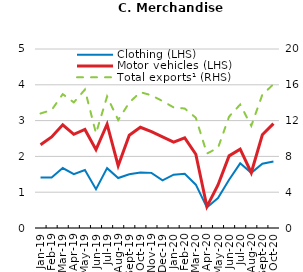
| Category | Clothing (LHS) | Motor vehicles (LHS) |
|---|---|---|
| 2019-01-01 | 1.414 | 2.328 |
| 2019-02-01 | 1.414 | 2.545 |
| 2019-03-01 | 1.674 | 2.883 |
| 2019-04-01 | 1.502 | 2.616 |
| 2019-05-01 | 1.621 | 2.753 |
| 2019-06-01 | 1.086 | 2.19 |
| 2019-07-01 | 1.672 | 2.9 |
| 2019-08-01 | 1.395 | 1.741 |
| 2019-09-01 | 1.5 | 2.592 |
| 2019-10-01 | 1.551 | 2.813 |
| 2019-11-01 | 1.54 | 2.69 |
| 2019-12-01 | 1.332 | 2.544 |
| 2020-01-01 | 1.49 | 2.398 |
| 2020-02-01 | 1.517 | 2.519 |
| 2020-03-01 | 1.21 | 2.061 |
| 2020-04-01 | 0.574 | 0.596 |
| 2020-05-01 | 0.837 | 1.202 |
| 2020-06-01 | 1.349 | 2.014 |
| 2020-07-01 | 1.807 | 2.2 |
| 2020-08-01 | 1.541 | 1.544 |
| 2020-09-01 | 1.795 | 2.605 |
| 2020-10-01 | 1.858 | 2.916 |